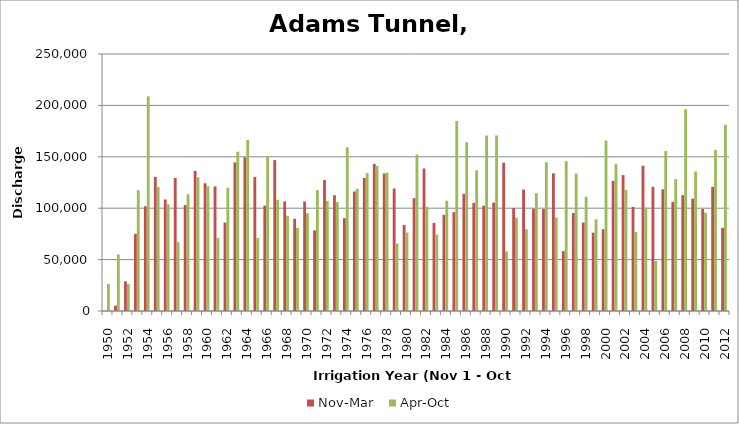
| Category | Nov-Mar  | Apr-Oct |
|---|---|---|
| 1950.0 | 0 | 26360.72 |
| 1951.0 | 5264.21 | 55086.15 |
| 1952.0 | 28829.39 | 26409.32 |
| 1953.0 | 75079.44 | 117530.31 |
| 1954.0 | 101919.97 | 208885.78 |
| 1955.0 | 130421.08 | 120578.15 |
| 1956.0 | 108527.39 | 103877.88 |
| 1957.0 | 129449.74 | 67245.62 |
| 1958.0 | 103067.63 | 113609.93 |
| 1959.0 | 136308.11 | 130110.26 |
| 1960.0 | 124271.44 | 121353.91 |
| 1961.0 | 121241.45 | 71306.83 |
| 1962.0 | 85963.5 | 119942.04 |
| 1963.0 | 144585.25 | 154921.46 |
| 1964.0 | 149419.05 | 166368.05 |
| 1965.0 | 130496.45 | 71037.66 |
| 1966.0 | 102507.29 | 149941.49 |
| 1967.0 | 146796.86 | 108229.08 |
| 1968.0 | 106621.06 | 92559.44 |
| 1969.0 | 89719.64 | 80957.33 |
| 1970.0 | 106498.08 | 95076.69 |
| 1971.0 | 78447.44 | 117587.23 |
| 1972.0 | 127483.51 | 107078.83 |
| 1973.0 | 112559.92 | 105946.87 |
| 1974.0 | 90285.55 | 159229.13 |
| 1975.0 | 116241.42 | 118949.91 |
| 1976.0 | 129383.71 | 134140.84 |
| 1977.0 | 143131.34 | 141017.82 |
| 1978.0 | 133787.08 | 134580.18 |
| 1979.0 | 119154.8 | 65550.14 |
| 1980.0 | 83698.94 | 76336.03 |
| 1981.0 | 109770.37 | 152065.44 |
| 1982.0 | 138630.79 | 101376.24 |
| 1983.0 | 85677.29 | 74321.91 |
| 1984.0 | 93599.37 | 107222.06 |
| 1985.0 | 96195.79 | 184818.55 |
| 1986.0 | 113975.88 | 164229.84 |
| 1987.0 | 105179.05 | 136820.04 |
| 1988.0 | 102394.22 | 170647.44 |
| 1989.0 | 105401.21 | 170778.68 |
| 1990.0 | 144222.44 | 57907.63 |
| 1991.0 | 100151.36 | 90767.25 |
| 1992.0 | 118085.68 | 79485.98 |
| 1993.0 | 99444.36 | 114653.31 |
| 1994.0 | 99190.66 | 144633.65 |
| 1995.0 | 133971.54 | 90994.26 |
| 1996.0 | 58295.37 | 145743.06 |
| 1997.0 | 95326.94 | 133685.88 |
| 1998.0 | 86015.02 | 111270.58 |
| 1999.0 | 76189.81 | 89157.53 |
| 2000.0 | 79612.55 | 165886.28 |
| 2001.0 | 126612.94 | 142895.3 |
| 2002.0 | 132222.99 | 117862.29 |
| 2003.0 | 101262.43 | 76837.83 |
| 2004.0 | 141312.47 | 100515.84 |
| 2005.0 | 120814.98 | 48727.46 |
| 2006.0 | 118381.23 | 155657.74 |
| 2007.0 | 106181.29 | 128307.36 |
| 2008.0 | 112617.19 | 196217.74 |
| 2009.0 | 109319.89 | 135759.08 |
| 2010.0 | 99280.62 | 95721.83 |
| 2011.0 | 120770.72 | 156680.93 |
| 2012.0 | 80912.71 | 181069.74 |